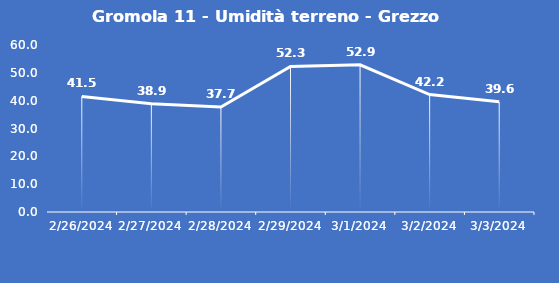
| Category | Gromola 11 - Umidità terreno - Grezzo (%VWC) |
|---|---|
| 2/26/24 | 41.5 |
| 2/27/24 | 38.9 |
| 2/28/24 | 37.7 |
| 2/29/24 | 52.3 |
| 3/1/24 | 52.9 |
| 3/2/24 | 42.2 |
| 3/3/24 | 39.6 |